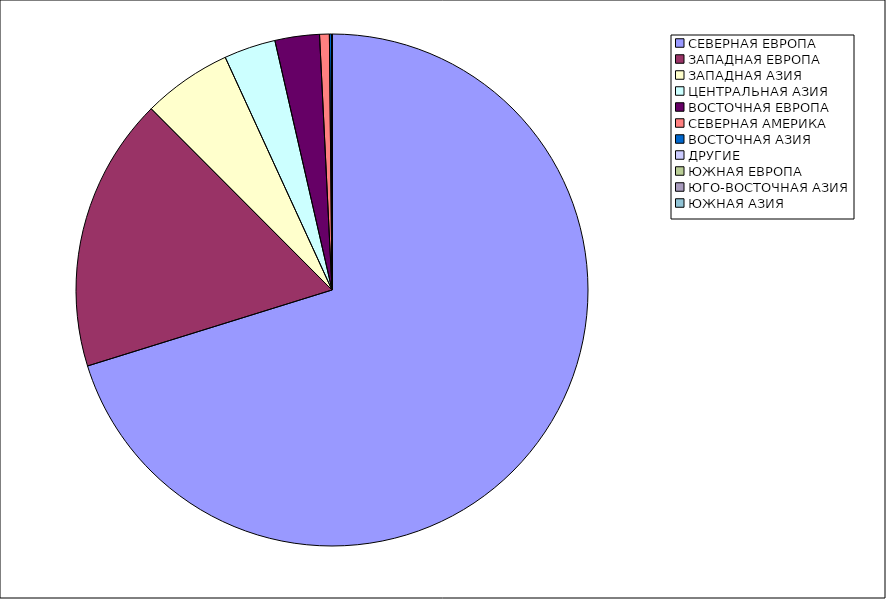
| Category | Оборот |
|---|---|
| СЕВЕРНАЯ ЕВРОПА | 70.203 |
| ЗАПАДНАЯ ЕВРОПА | 17.316 |
| ЗАПАДНАЯ АЗИЯ | 5.634 |
| ЦЕНТРАЛЬНАЯ АЗИЯ | 3.263 |
| ВОСТОЧНАЯ ЕВРОПА | 2.807 |
| СЕВЕРНАЯ АМЕРИКА | 0.614 |
| ВОСТОЧНАЯ АЗИЯ | 0.132 |
| ДРУГИЕ | 0.028 |
| ЮЖНАЯ ЕВРОПА | 0.002 |
| ЮГО-ВОСТОЧНАЯ АЗИЯ | 0 |
| ЮЖНАЯ АЗИЯ | 0 |